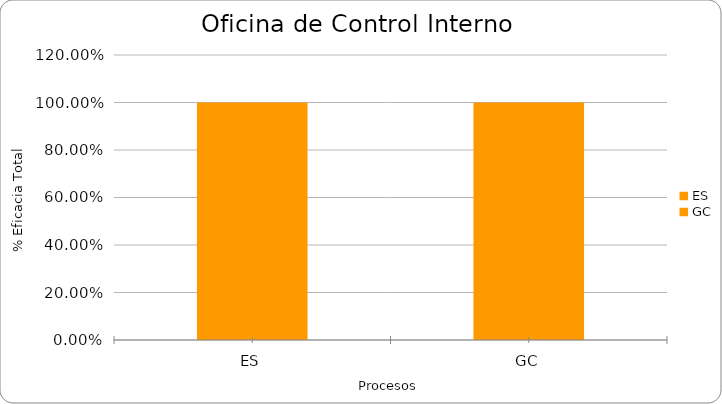
| Category | % Eficacia total |
|---|---|
| ES | 1 |
| GC | 1 |